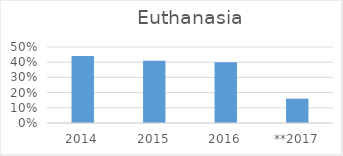
| Category | Euthanasia |
|---|---|
| 2014 | 0.44 |
| 2015 | 0.41 |
| 2016 | 0.4 |
| **2017 | 0.16 |